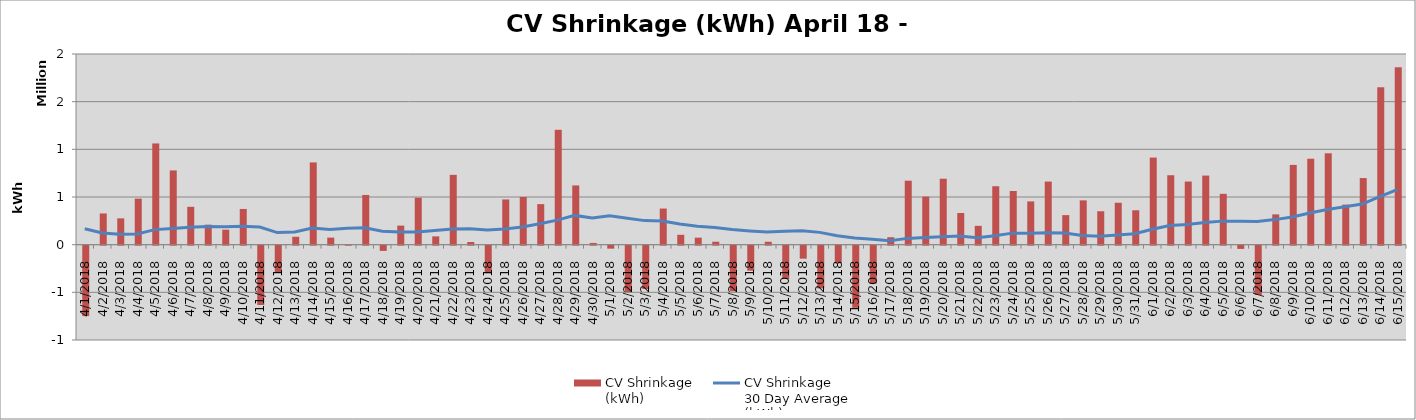
| Category | CV Shrinkage
(kWh) |
|---|---|
| 4/1/18 | -738624 |
| 4/2/18 | 327398 |
| 4/3/18 | 275905 |
| 4/4/18 | 483044 |
| 4/5/18 | 1061787 |
| 4/6/18 | 778778 |
| 4/7/18 | 397072 |
| 4/8/18 | 209880 |
| 4/9/18 | 157006 |
| 4/10/18 | 374594 |
| 4/11/18 | -622327 |
| 4/12/18 | -285900 |
| 4/13/18 | 82775 |
| 4/14/18 | 862938 |
| 4/15/18 | 74009 |
| 4/16/18 | 5038 |
| 4/17/18 | 521427 |
| 4/18/18 | -54799 |
| 4/19/18 | 199810 |
| 4/20/18 | 492350 |
| 4/21/18 | 86841 |
| 4/22/18 | 732288 |
| 4/23/18 | 28193 |
| 4/24/18 | -289203 |
| 4/25/18 | 474373 |
| 4/26/18 | 500354 |
| 4/27/18 | 425305 |
| 4/28/18 | 1205024 |
| 4/29/18 | 621369 |
| 4/30/18 | 17919 |
| 5/1/18 | -31332 |
| 5/2/18 | -487644 |
| 5/3/18 | -454913 |
| 5/4/18 | 378792 |
| 5/5/18 | 103540 |
| 5/6/18 | 73454 |
| 5/7/18 | 30705 |
| 5/8/18 | -478550 |
| 5/9/18 | -262385 |
| 5/10/18 | 30476 |
| 5/11/18 | -349540 |
| 5/12/18 | -136353 |
| 5/13/18 | -448094 |
| 5/14/18 | -184678 |
| 5/15/18 | -652117 |
| 5/16/18 | -397459 |
| 5/17/18 | 78054 |
| 5/18/18 | 671040 |
| 5/19/18 | 504429 |
| 5/20/18 | 691920 |
| 5/21/18 | 332104 |
| 5/22/18 | 197358 |
| 5/23/18 | 612924 |
| 5/24/18 | 563123 |
| 5/25/18 | 453831 |
| 5/26/18 | 661923 |
| 5/27/18 | 309941 |
| 5/28/18 | 464684 |
| 5/29/18 | 350622 |
| 5/30/18 | 439663 |
| 5/31/18 | 360994 |
| 6/1/18 | 913769 |
| 6/2/18 | 728307 |
| 6/3/18 | 662326 |
| 6/4/18 | 724701 |
| 6/5/18 | 532883 |
| 6/6/18 | -34028 |
| 6/7/18 | -517452 |
| 6/8/18 | 317686 |
| 6/9/18 | 836629 |
| 6/10/18 | 901414 |
| 6/11/18 | 958595 |
| 6/12/18 | 420055 |
| 6/13/18 | 698788 |
| 6/14/18 | 1651359 |
| 6/15/18 | 1861656 |